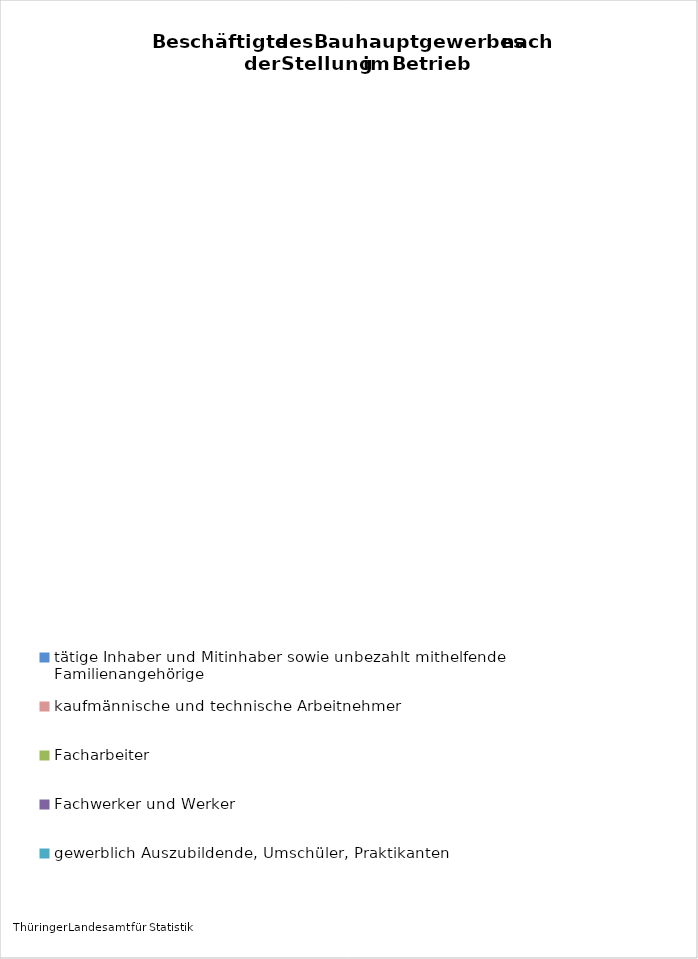
| Category | Beschäftigte |
|---|---|
| tätige Inhaber und Mitinhaber sowie unbezahlt mithelfende Familienangehörige | 2297 |
| kaufmännische und technische Arbeitnehmer | 4921 |
| Facharbeiter | 14388 |
| Fachwerker und Werker | 3615 |
| gewerblich Auszubildende, Umschüler, Praktikanten | 726 |